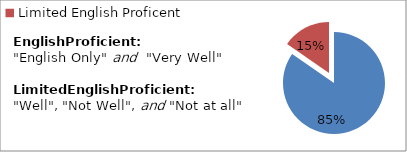
| Category | Percent |
|---|---|
| English Proficient | 0.847 |
| Limited English Proficent | 0.153 |